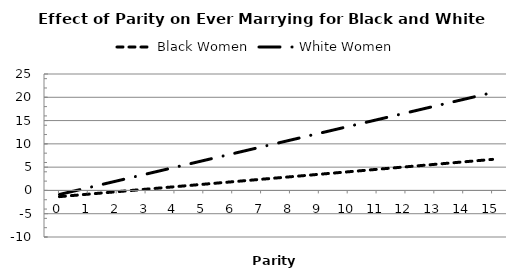
| Category | Black Women | White Women |
|---|---|---|
| 0.0 | -1.335 | -0.865 |
| 1.0 | -0.801 | 0.594 |
| 2.0 | -0.268 | 2.053 |
| 3.0 | 0.266 | 3.512 |
| 4.0 | 0.799 | 4.97 |
| 5.0 | 1.333 | 6.429 |
| 6.0 | 1.866 | 7.888 |
| 7.0 | 2.4 | 9.347 |
| 8.0 | 2.934 | 10.806 |
| 9.0 | 3.467 | 12.265 |
| 10.0 | 4.001 | 13.724 |
| 11.0 | 4.534 | 15.183 |
| 12.0 | 5.068 | 16.642 |
| 13.0 | 5.601 | 18.101 |
| 14.0 | 6.135 | 19.56 |
| 15.0 | 6.669 | 21.018 |